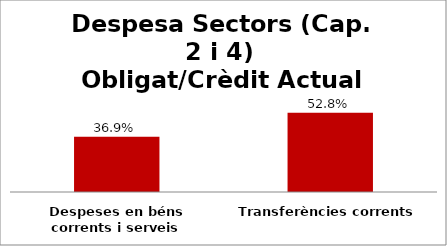
| Category | Series 0 |
|---|---|
| Despeses en béns corrents i serveis | 0.369 |
| Transferències corrents | 0.528 |